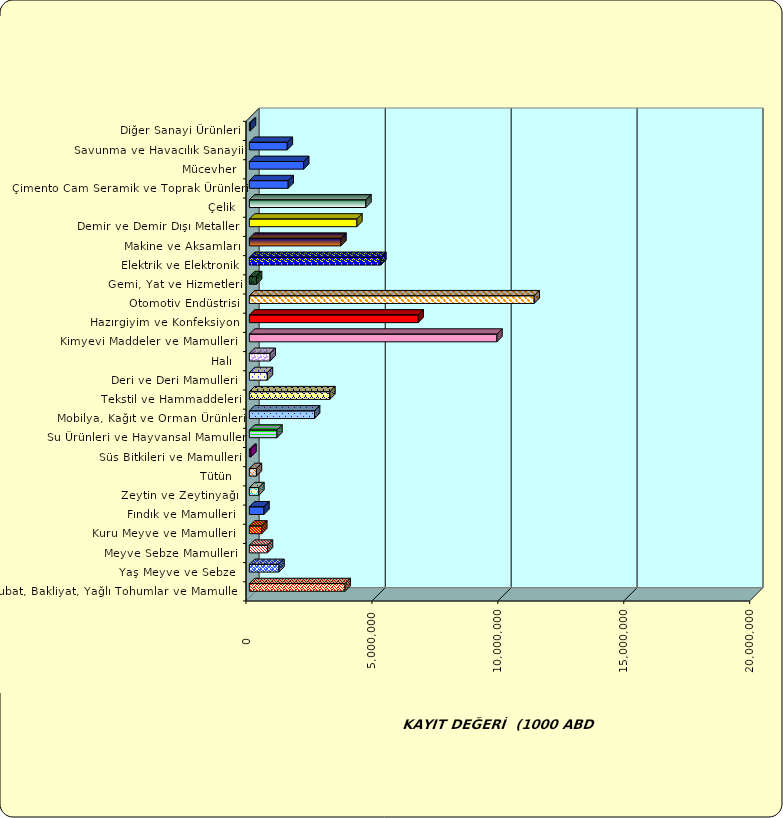
| Category | Series 0 |
|---|---|
|  Hububat, Bakliyat, Yağlı Tohumlar ve Mamulleri  | 3801213.862 |
|  Yaş Meyve ve Sebze   | 1176424.275 |
|  Meyve Sebze Mamulleri  | 718614.583 |
|  Kuru Meyve ve Mamulleri   | 493204.243 |
|  Fındık ve Mamulleri  | 579741.162 |
|  Zeytin ve Zeytinyağı  | 377016.57 |
|  Tütün  | 280596.511 |
|  Süs Bitkileri ve Mamulleri | 62579.552 |
|  Su Ürünleri ve Hayvansal Mamuller | 1096486.821 |
|  Mobilya, Kağıt ve Orman Ürünleri | 2589754.657 |
|  Tekstil ve Hammaddeleri | 3198112.795 |
|  Deri ve Deri Mamulleri  | 716608.044 |
|  Halı  | 826151.188 |
|  Kimyevi Maddeler ve Mamulleri   | 9831174.154 |
|  Hazırgiyim ve Konfeksiyon  | 6703623.358 |
|  Otomotiv Endüstrisi | 11310544.968 |
|  Gemi, Yat ve Hizmetleri | 286075.76 |
|  Elektrik ve Elektronik | 5220665.489 |
|  Makine ve Aksamları | 3637134.478 |
|  Demir ve Demir Dışı Metaller  | 4269960.89 |
|  Çelik | 4628666.209 |
|  Çimento Cam Seramik ve Toprak Ürünleri | 1542225.801 |
|  Mücevher | 2157020.766 |
|  Savunma ve Havacılık Sanayii | 1507900.205 |
|  Diğer Sanayi Ürünleri | 43113.381 |